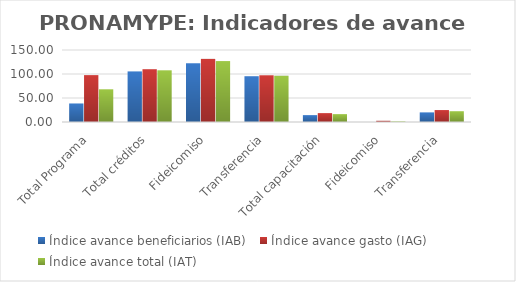
| Category | Índice avance beneficiarios (IAB)  | Índice avance gasto (IAG) | Índice avance total (IAT)  |
|---|---|---|---|
| Total Programa | 38.613 | 97.67 | 68.142 |
| Total créditos | 105.4 | 109.985 | 107.693 |
| Fideicomiso | 122.372 | 131.491 | 126.931 |
| Transferencia | 95.39 | 97.335 | 96.362 |
| Total capacitación | 14.327 | 18.498 | 16.413 |
| Fideicomiso | 0 | 2.535 | 1.267 |
| Transferencia | 20.051 | 24.884 | 22.467 |